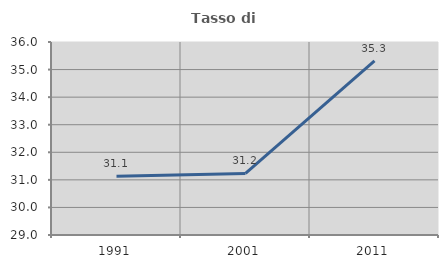
| Category | Tasso di occupazione   |
|---|---|
| 1991.0 | 31.127 |
| 2001.0 | 31.231 |
| 2011.0 | 35.313 |